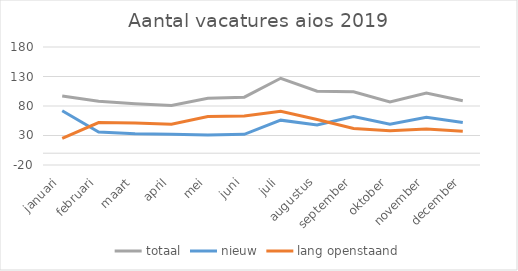
| Category | totaal | nieuw | lang openstaand |
|---|---|---|---|
| januari | 97 | 72 | 25 |
| februari | 88 | 36 | 52 |
| maart | 84 | 33 | 51 |
| april | 81 | 32 | 49 |
| mei | 93 | 31 | 62 |
| juni | 95 | 32 | 63 |
| juli | 127 | 56 | 71 |
| augustus | 105 | 48 | 57 |
| september | 104 | 62 | 42 |
| oktober | 87 | 49 | 38 |
| november | 102 | 61 | 41 |
| december | 89 | 52 | 37 |